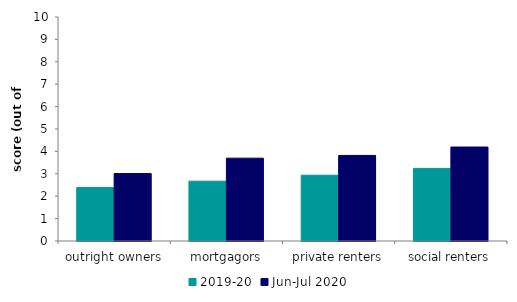
| Category | 2019-20 | Jun-Jul 2020 |
|---|---|---|
| outright owners | 2.384 | 3.011 |
| mortgagors | 2.671 | 3.697 |
| private renters | 2.937 | 3.82 |
| social renters | 3.24 | 4.195 |